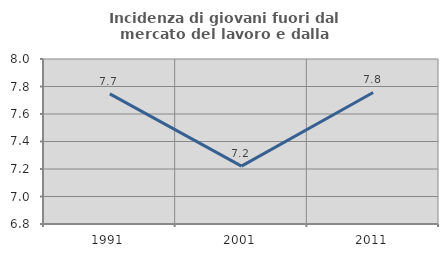
| Category | Incidenza di giovani fuori dal mercato del lavoro e dalla formazione  |
|---|---|
| 1991.0 | 7.746 |
| 2001.0 | 7.221 |
| 2011.0 | 7.757 |